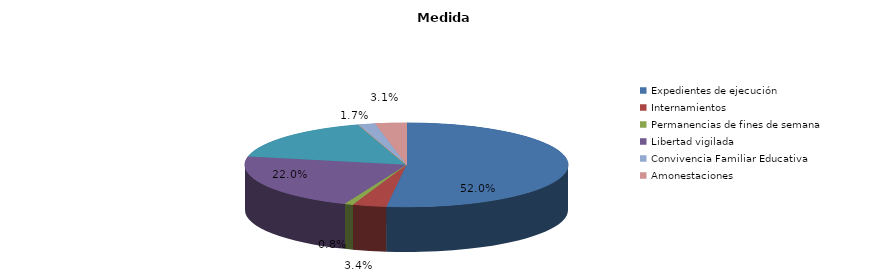
| Category | Series 0 |
|---|---|
| Expedientes de ejecución | 184 |
| Internamientos | 12 |
| Permanencias de fines de semana | 3 |
| Libertad vigilada | 78 |
| Prestaciones en beneficio de la comunidad | 60 |
| Privación de permisos y licencias | 0 |
| Convivencia Familiar Educativa | 6 |
| Amonestaciones | 11 |